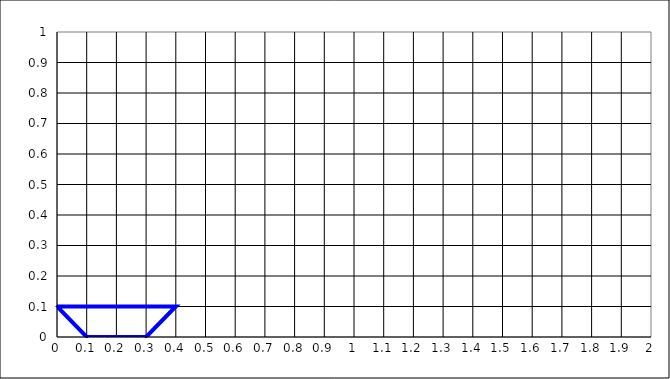
| Category | Series 0 |
|---|---|
| 0.1 | 0 |
| 0.30000000000000004 | 0 |
| 0.4 | 0.1 |
| 0.0 | 0.1 |
| 0.1 | 0 |
| nan | -0.2 |